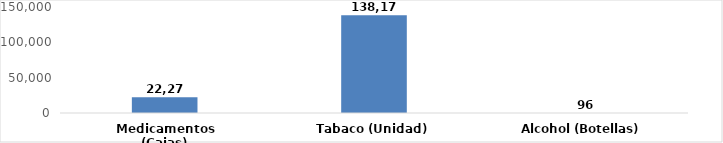
| Category | Series 0 |
|---|---|
| Medicamentos (Cajas) | 22276 |
| Tabaco (Unidad) | 138179 |
| Alcohol (Botellas) | 96 |